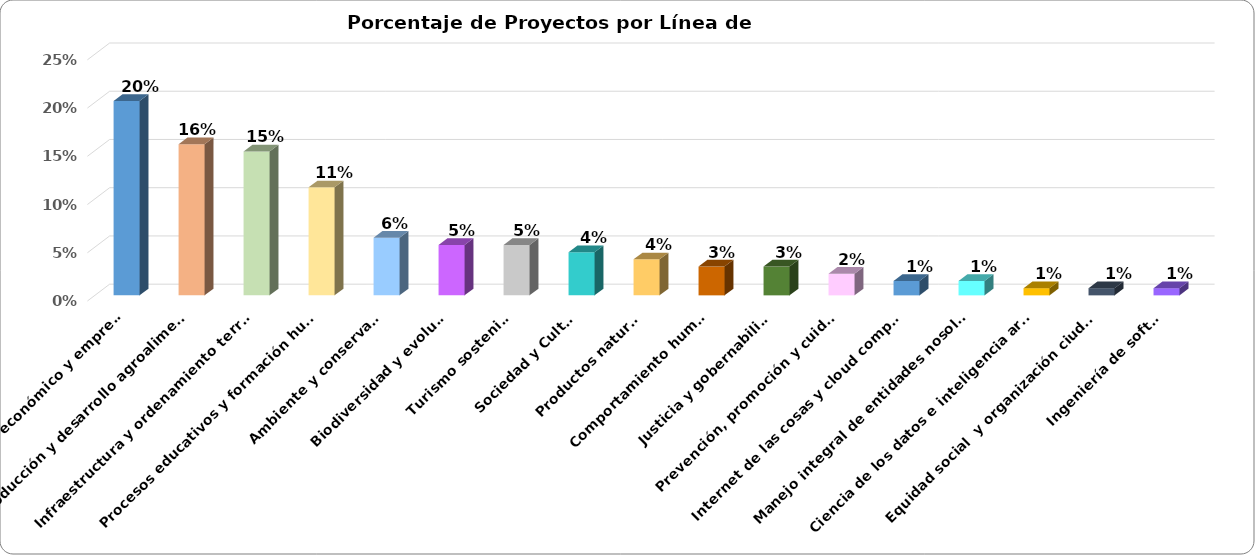
| Category | Desarrollo económico y empresarial |
|---|---|
| Desarrollo económico y empresarial | 0.201 |
| Producción y desarrollo agroalimentario | 0.157 |
| Infraestructura y ordenamiento territorial | 0.149 |
| Procesos educativos y formación humana | 0.112 |
| Ambiente y conservación | 0.06 |
| Biodiversidad y evolución | 0.052 |
| Turismo sostenible | 0.052 |
| Sociedad y Cultura | 0.045 |
| Productos naturales | 0.037 |
| Comportamiento humano | 0.03 |
| Justicia y gobernabilidad | 0.03 |
| Prevención, promoción y cuidados | 0.022 |
| Internet de las cosas y cloud computing | 0.015 |
| Manejo integral de entidades nosológicas | 0.015 |
| Ciencia de los datos e inteligencia artificial | 0.007 |
| Equidad social  y organización ciudadana | 0.007 |
| Ingeniería de software | 0.007 |